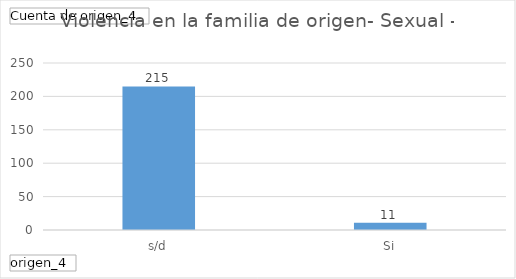
| Category | Total |
|---|---|
| s/d | 215 |
| Si | 11 |